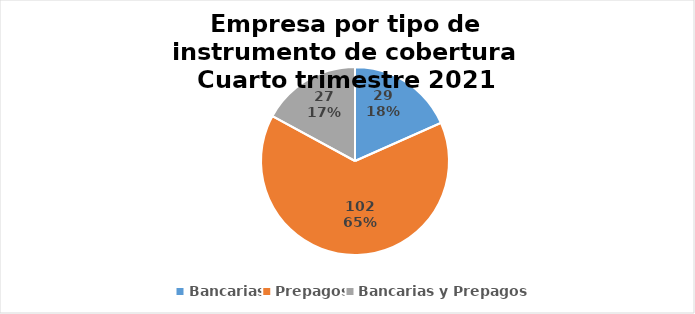
| Category | Series 0 |
|---|---|
| Bancarias | 29 |
| Prepagos | 102 |
| Bancarias y Prepagos | 27 |